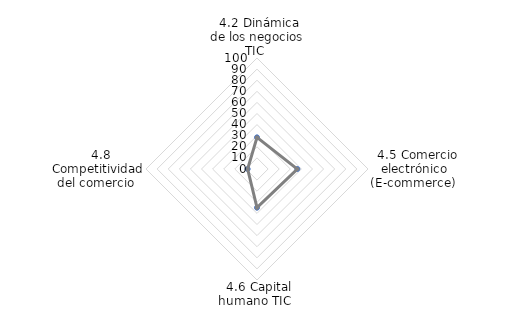
| Category | NACIONAL |
|---|---|
|  4.2 Dinámica de los negocios TIC  | 28.5 |
|  4.5 Comercio electrónico (E-commerce)  | 36.333 |
|  4.6 Capital humano TIC  | 34.853 |
|  4.8 Competitividad del comercio  | 8.433 |